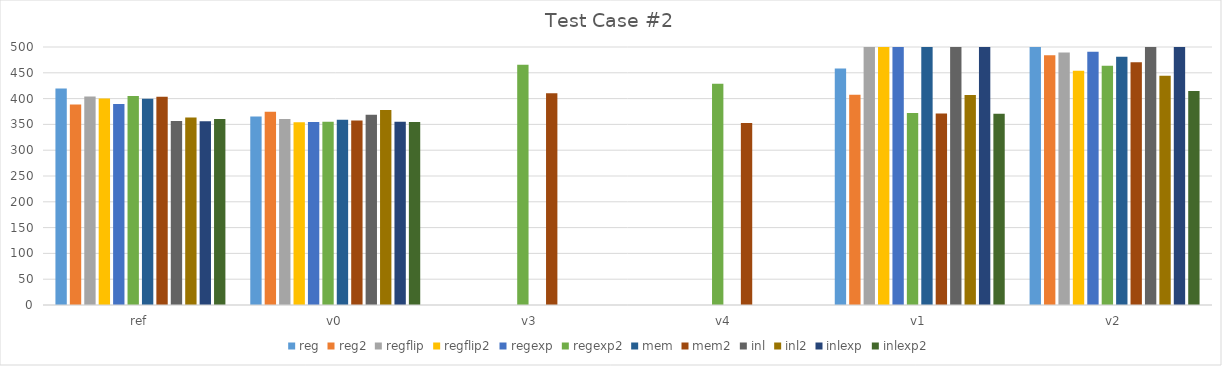
| Category | reg | reg2 | regflip | regflip2 | regexp | regexp2 | mem | mem2 | inl | inl2 | inlexp | inlexp2 |
|---|---|---|---|---|---|---|---|---|---|---|---|---|
| ref | 419.671 | 388.363 | 403.926 | 400.216 | 389.442 | 405.141 | 399.511 | 403.426 | 356.529 | 363.463 | 356.145 | 360.279 |
| v0 | 365.173 | 374.627 | 360.291 | 354.249 | 354.532 | 355.169 | 359.044 | 357.557 | 368.932 | 378.057 | 354.986 | 354.584 |
| v3 | 0 | 0 | 0 | 0 | 0 | 465.402 | 0 | 410.462 | 0 | 0 | 0 | 0 |
| v4 | 0 | 0 | 0 | 0 | 0 | 428.899 | 0 | 352.72 | 0 | 0 | 0 | 0 |
| v1 | 458.489 | 407.543 | 830.849 | 718.151 | 717.675 | 371.956 | 716.507 | 371.225 | 715.556 | 406.816 | 717.544 | 370.746 |
| v2 | 600.132 | 483.994 | 489.268 | 453.88 | 490.725 | 463.742 | 481.181 | 470.351 | 713.78 | 444.153 | 713.561 | 414.651 |